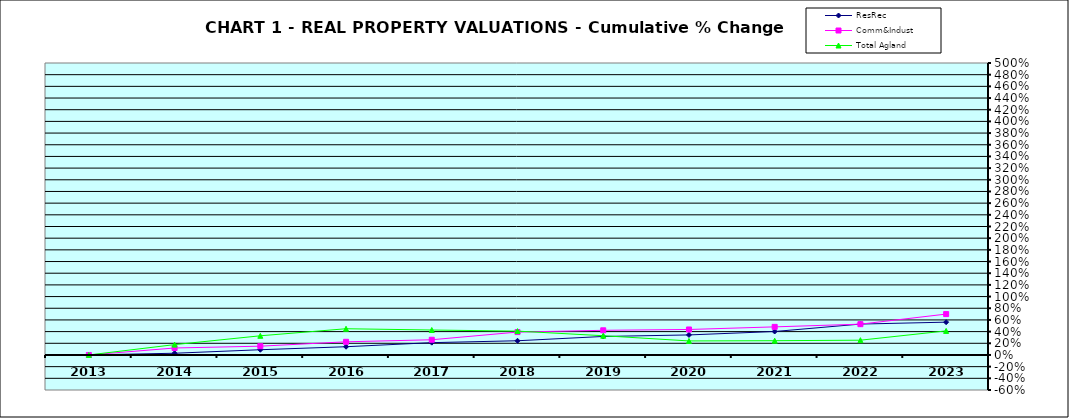
| Category | ResRec | Comm&Indust | Total Agland |
|---|---|---|---|
| 2013.0 | 0 | 0 | 0 |
| 2014.0 | 0.029 | 0.119 | 0.177 |
| 2015.0 | 0.09 | 0.15 | 0.328 |
| 2016.0 | 0.141 | 0.225 | 0.449 |
| 2017.0 | 0.211 | 0.26 | 0.427 |
| 2018.0 | 0.243 | 0.392 | 0.408 |
| 2019.0 | 0.317 | 0.422 | 0.329 |
| 2020.0 | 0.343 | 0.436 | 0.24 |
| 2021.0 | 0.402 | 0.481 | 0.244 |
| 2022.0 | 0.529 | 0.527 | 0.253 |
| 2023.0 | 0.562 | 0.7 | 0.412 |